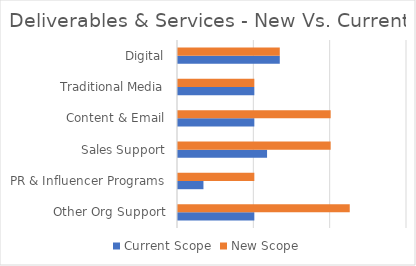
| Category | Current Scope | New Scope |
|---|---|---|
| Other Org Support | 1 | 2.25 |
| PR & Influencer Programs | 0.333 | 1 |
| Sales Support | 1.167 | 2 |
| Content & Email | 1 | 2 |
| Traditional Media | 1 | 1 |
| Digital | 1.333 | 1.333 |